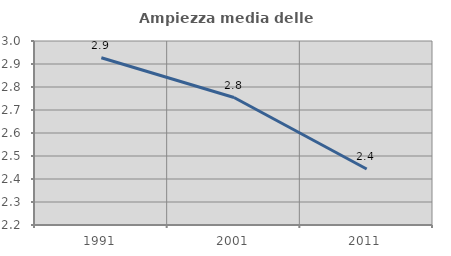
| Category | Ampiezza media delle famiglie |
|---|---|
| 1991.0 | 2.927 |
| 2001.0 | 2.754 |
| 2011.0 | 2.443 |